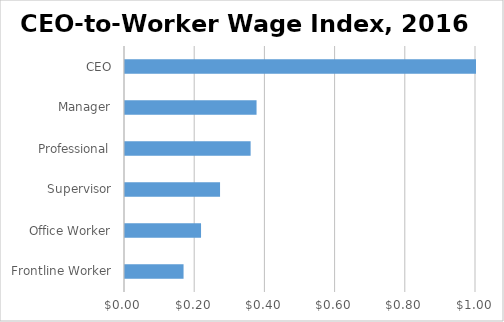
| Category | Series 0 |
|---|---|
| Frontline Worker | 0.167 |
| Office Worker | 0.217 |
| Supervisor | 0.271 |
| Professional | 0.358 |
| Manager | 0.375 |
| CEO | 1 |